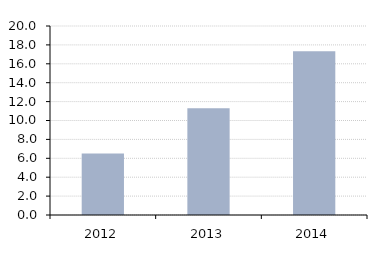
| Category | Times Interest Earned |
|---|---|
| 2012.0 | 6.5 |
| 2013.0 | 11.289 |
| 2014.0 | 17.33 |